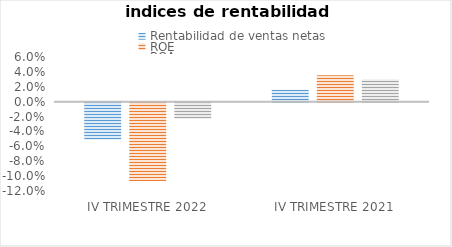
| Category | Rentabilidad de ventas netas | ROE | ROA |
|---|---|---|---|
| IV TRIMESTRE 2022 | -0.05 | -0.105 | -0.022 |
| IV TRIMESTRE 2021 | 0.016 | 0.036 | 0.03 |